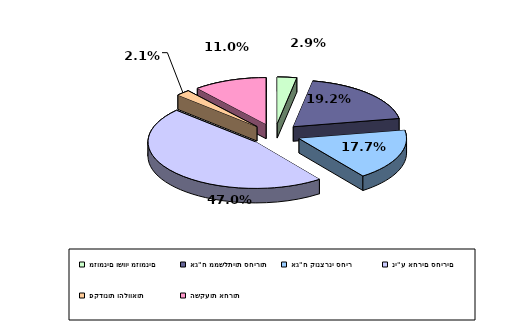
| Category | Series 0 |
|---|---|
| מזומנים ושווי מזומנים | 0.029 |
| אג"ח ממשלתיות סחירות | 0.192 |
| אג"ח קונצרני סחיר | 0.177 |
| ני"ע אחרים סחירים | 0.47 |
| פקדונות והלוואות | 0.021 |
| השקעות אחרות | 0.11 |